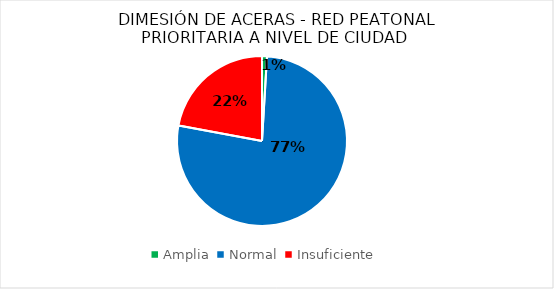
| Category | Series 0 | Series 1 |
|---|---|---|
| Amplia | 4012 | 0.94 |
| Normal | 328620 | 76.987 |
| Insuficiente | 94220 | 22.073 |